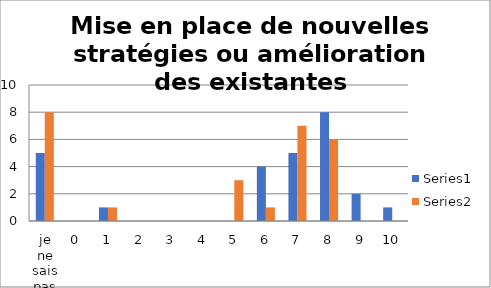
| Category | Series 0 | Series 1 |
|---|---|---|
| je ne sais pas | 5 | 8 |
| 0 | 0 | 0 |
| 1 | 1 | 1 |
| 2 | 0 | 0 |
| 3 | 0 | 0 |
| 4 | 0 | 0 |
| 5 | 0 | 3 |
| 6 | 4 | 1 |
| 7 | 5 | 7 |
| 8 | 8 | 6 |
| 9 | 2 | 0 |
| 10 | 1 | 0 |